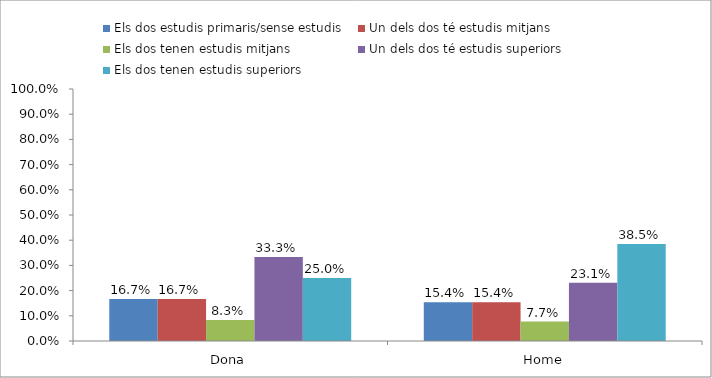
| Category | Els dos estudis primaris/sense estudis | Un dels dos té estudis mitjans | Els dos tenen estudis mitjans | Un dels dos té estudis superiors | Els dos tenen estudis superiors |
|---|---|---|---|---|---|
| Dona | 0.167 | 0.167 | 0.083 | 0.333 | 0.25 |
| Home | 0.154 | 0.154 | 0.077 | 0.231 | 0.385 |